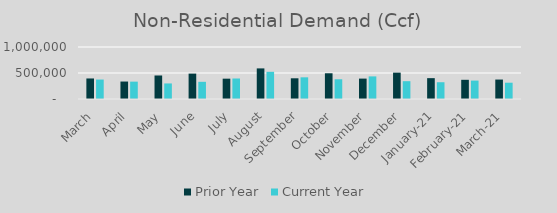
| Category | Prior Year | Current Year |
|---|---|---|
| March | 394966.802 | 374117 |
| April | 335781.44 | 333800.488 |
| May | 452130.67 | 299245.56 |
| June | 488107.52 | 330441.187 |
| July | 390975.65 | 394304.316 |
| August | 588468.22 | 522963.473 |
| September | 398263 | 416886.629 |
| October | 494775 | 379515 |
| November | 392357 | 434815 |
| December | 507022 | 342584.594 |
| January-21 | 400923.849 | 322657.16 |
| February-21 | 369131.684 | 354041 |
| March-21 | 374117 | 313343 |